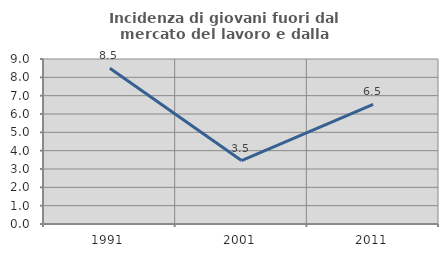
| Category | Incidenza di giovani fuori dal mercato del lavoro e dalla formazione  |
|---|---|
| 1991.0 | 8.496 |
| 2001.0 | 3.463 |
| 2011.0 | 6.522 |